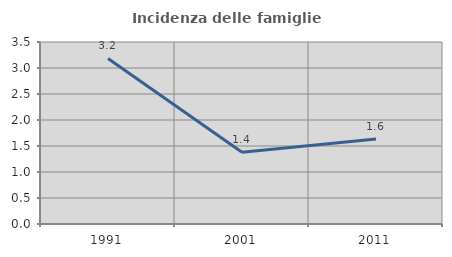
| Category | Incidenza delle famiglie numerose |
|---|---|
| 1991.0 | 3.184 |
| 2001.0 | 1.378 |
| 2011.0 | 1.636 |